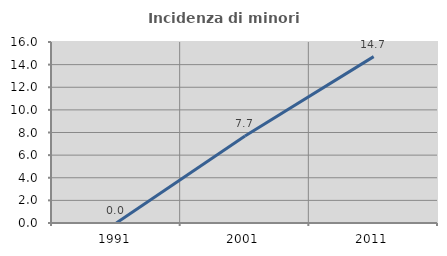
| Category | Incidenza di minori stranieri |
|---|---|
| 1991.0 | 0 |
| 2001.0 | 7.692 |
| 2011.0 | 14.706 |